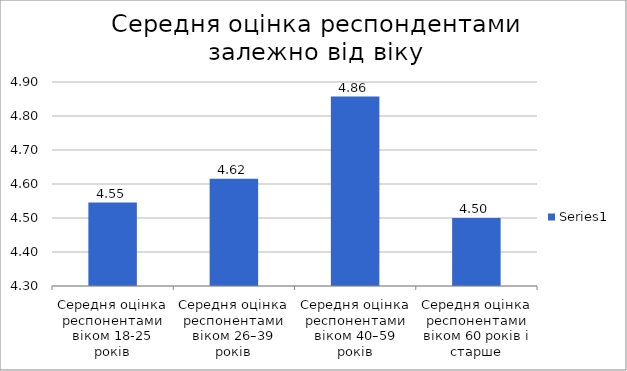
| Category | Series 0 |
|---|---|
| Середня оцінка респонентами віком 18-25 років | 4.545 |
| Середня оцінка респонентами віком 26–39 років | 4.615 |
| Середня оцінка респонентами віком 40–59 років | 4.857 |
| Середня оцінка респонентами віком 60 років і старше | 4.5 |